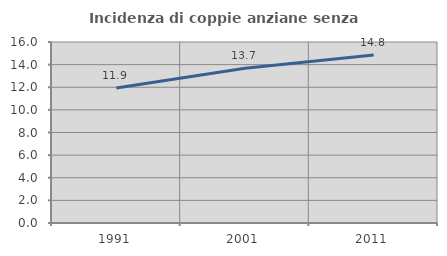
| Category | Incidenza di coppie anziane senza figli  |
|---|---|
| 1991.0 | 11.943 |
| 2001.0 | 13.676 |
| 2011.0 | 14.844 |